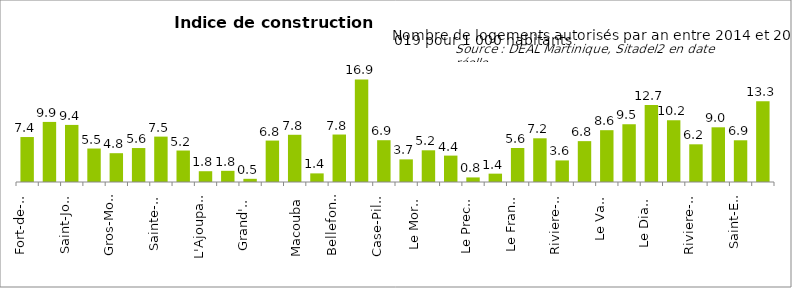
| Category | Series 0 |
|---|---|
| Fort-de-France | 7.432 |
| Le Lamentin | 9.931 |
| Saint-Joseph | 9.435 |
| Schoelcher | 5.532 |
| Gros-Morne | 4.761 |
| Le Robert | 5.612 |
| Sainte-Marie | 7.501 |
| La Trinité | 5.203 |
| L'Ajoupa-Bouillon | 1.782 |
| Basse-Pointe | 1.846 |
| Grand'Riviere | 0.526 |
| Le Lorrain | 6.848 |
| Macouba | 7.805 |
| Le Marigot | 1.424 |
| Bellefontaine | 7.847 |
| Le Carbet | 16.947 |
| Case-Pilote | 6.907 |
| Fonds-Saint-Denis | 3.741 |
| Le Morne-Rouge | 5.24 |
| Le Morne-Vert | 4.363 |
| Le Precheur | 0.757 |
| Saint-Pierre | 1.379 |
| Le Francois | 5.616 |
| Le Marin | 7.224 |
| Riviere-Pilote | 3.567 |
| Sainte-Anne | 6.755 |
| Le Vauclin | 8.563 |
| Les Anses-d'Arlet | 9.546 |
| Le Diamant | 12.725 |
| Ducos | 10.207 |
| Riviere-Salee | 6.23 |
| Sainte-Luce | 9.04 |
| Saint-Esprit | 6.894 |
| Les Trois-Ilets | 13.336 |